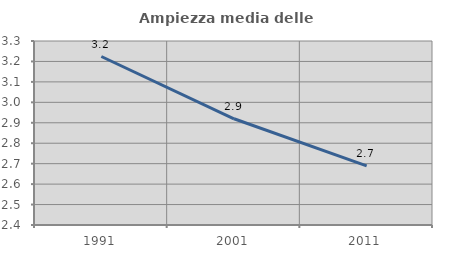
| Category | Ampiezza media delle famiglie |
|---|---|
| 1991.0 | 3.224 |
| 2001.0 | 2.92 |
| 2011.0 | 2.689 |